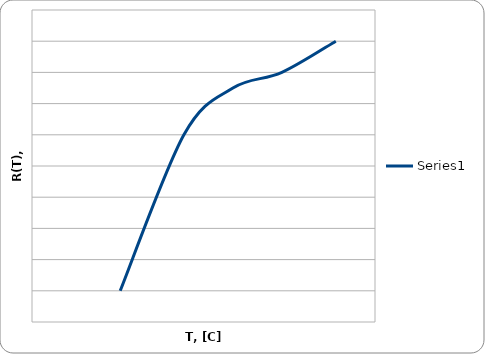
| Category | Series 0 |
|---|---|
| 18.0 | 100.2 |
| 31.0 | 100.3 |
| 41.0 | 100.33 |
| 51.0 | 100.34 |
| 62.0 | 100.36 |